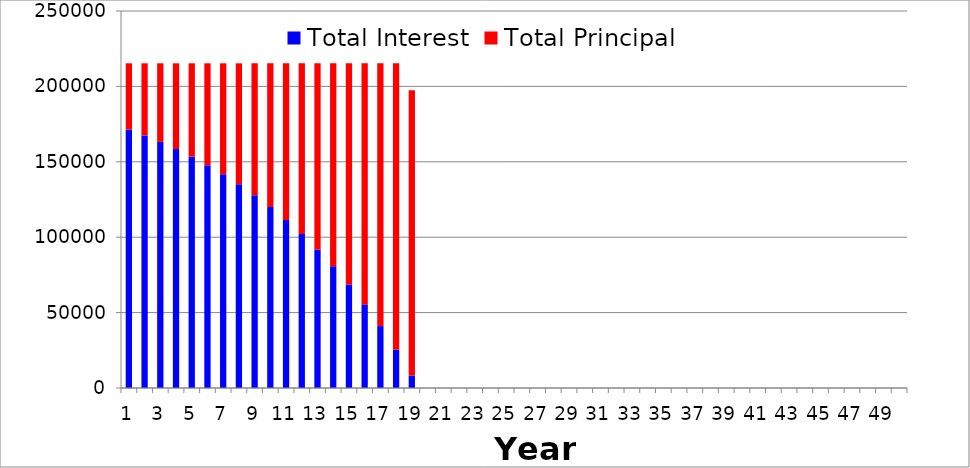
| Category | Total Interest | Total Principal |
|---|---|---|
| 1.0 | 171430.458 | 43880.603 |
| 2.0 | 167480.628 | 47830.433 |
| 3.0 | 163175.261 | 52135.799 |
| 4.0 | 158482.356 | 56828.705 |
| 5.0 | 153367.027 | 61944.034 |
| 6.0 | 147791.251 | 67519.809 |
| 7.0 | 141713.583 | 73597.477 |
| 8.0 | 135088.845 | 80222.216 |
| 9.0 | 127867.793 | 87443.267 |
| 10.0 | 119996.752 | 95314.308 |
| 11.0 | 111417.214 | 103893.846 |
| 12.0 | 102065.405 | 113245.655 |
| 13.0 | 91871.811 | 123439.25 |
| 14.0 | 80760.659 | 134550.401 |
| 15.0 | 68649.358 | 146661.702 |
| 16.0 | 55447.881 | 159863.179 |
| 17.0 | 41058.098 | 174252.962 |
| 18.0 | 25373.046 | 189938.014 |
| 19.0 | 8276.133 | 189092.339 |
| 20.0 | 0 | 0 |
| 21.0 | 0 | 0 |
| 22.0 | 0 | 0 |
| 23.0 | 0 | 0 |
| 24.0 | 0 | 0 |
| 25.0 | 0 | 0 |
| 26.0 | 0 | 0 |
| 27.0 | 0 | 0 |
| 28.0 | 0 | 0 |
| 29.0 | 0 | 0 |
| 30.0 | 0 | 0 |
| 31.0 | 0 | 0 |
| 32.0 | 0 | 0 |
| 33.0 | 0 | 0 |
| 34.0 | 0 | 0 |
| 35.0 | 0 | 0 |
| 36.0 | 0 | 0 |
| 37.0 | 0 | 0 |
| 38.0 | 0 | 0 |
| 39.0 | 0 | 0 |
| 40.0 | 0 | 0 |
| 41.0 | 0 | 0 |
| 42.0 | 0 | 0 |
| 43.0 | 0 | 0 |
| 44.0 | 0 | 0 |
| 45.0 | 0 | 0 |
| 46.0 | 0 | 0 |
| 47.0 | 0 | 0 |
| 48.0 | 0 | 0 |
| 49.0 | 0 | 0 |
| 50.0 | 0 | 0 |